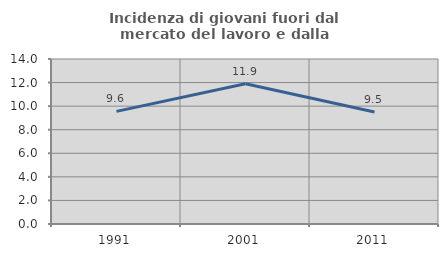
| Category | Incidenza di giovani fuori dal mercato del lavoro e dalla formazione  |
|---|---|
| 1991.0 | 9.556 |
| 2001.0 | 11.897 |
| 2011.0 | 9.505 |